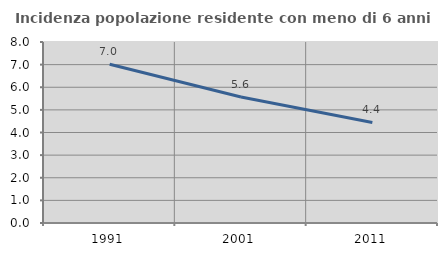
| Category | Incidenza popolazione residente con meno di 6 anni |
|---|---|
| 1991.0 | 7.019 |
| 2001.0 | 5.572 |
| 2011.0 | 4.443 |